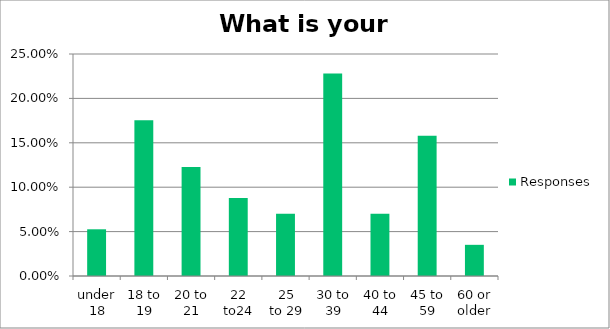
| Category | Responses |
|---|---|
| under 18 | 0.053 |
| 18 to 19 | 0.175 |
| 20 to 21 | 0.123 |
| 22 to24 | 0.088 |
| 25 to 29 | 0.07 |
| 30 to 39 | 0.228 |
| 40 to 44 | 0.07 |
| 45 to 59 | 0.158 |
| 60 or older | 0.035 |